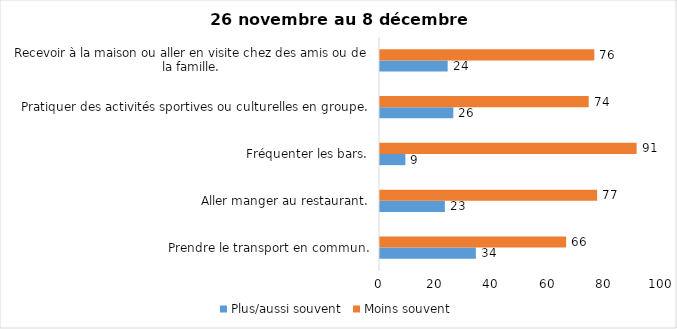
| Category | Plus/aussi souvent | Moins souvent |
|---|---|---|
| Prendre le transport en commun. | 34 | 66 |
| Aller manger au restaurant. | 23 | 77 |
| Fréquenter les bars. | 9 | 91 |
| Pratiquer des activités sportives ou culturelles en groupe. | 26 | 74 |
| Recevoir à la maison ou aller en visite chez des amis ou de la famille. | 24 | 76 |